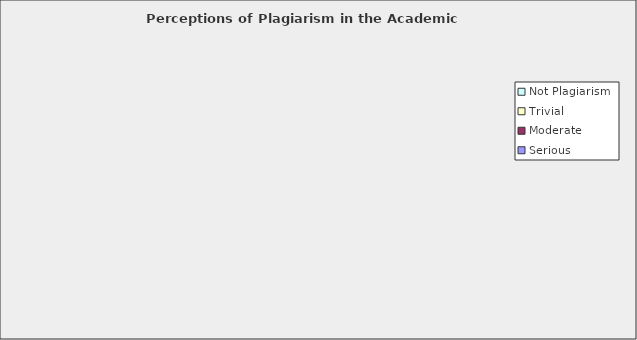
| Category | Serious | Moderate | Trivial | Not Plagiarism |
|---|---|---|---|---|
| Working on an assignment with others (in person) when the professor asked for individual work | 223 | 280 | 102 | 30 |
| Working on an assignment with others (via e-mail/chat) when the professor asked for individual work | 209 | 269 | 122 | 34 |
| In a course requiring computer work, copying another student’s program rather than writing your own | 532 | 82 | 12 | 7 |
| Incorporating another’s course lab data as your own | 485 | 126 | 16 | 6 |
| Incorporating another’s research data as your own | 592 | 35 | 2 | 4 |
| Paraphrasing or copying a few sentences from a book, magazine, or journal (not electronic or Web-based) without citing them in a paper you submitted | 408 | 190 | 26 | 10 |
| Paraphrasing or copying a few sentences from a book, magazine, or journal (electronic/Internet) without citing them in a paper you submitted | 408 | 179 | 38 | 8 |
| Turning in a paper written and previously submitted by another student and claiming it as your own work | 620 | 9 | 1 | 5 |
| Quoting another author in your own work without citing them in a paper you submitted | 460 | 147 | 20 | 7 |
| Copying material, almost word for word, from any written source and turning it in as your own work | 604 | 25 | 1 | 4 |
| Turning in work done by someone else | 600 | 25 | 3 | 6 |
| Turning in the same paper for another class | 195 | 218 | 129 | 91 |
| Copying and pasting directly from several different sources and combining them to create a paragraph for a paper | 484 | 112 | 25 | 11 |
| Accidentally or purposely adding/deleting/changing words in a quotation | 251 | 261 | 89 | 30 |